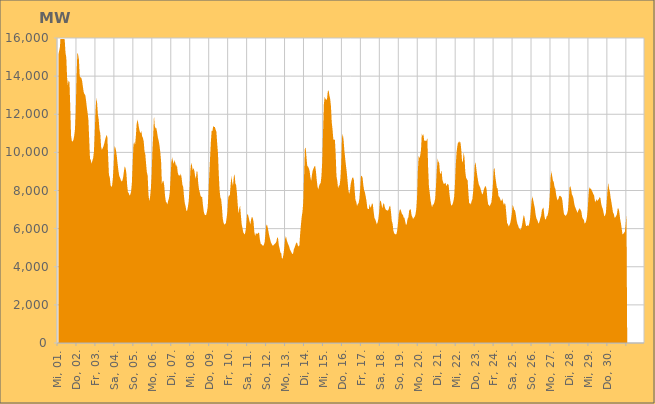
| Category | Series 0 |
|---|---|
|  Mi, 01.  | 15129.188 |
|  Mi, 01.  | 15332.794 |
|  Mi, 01.  | 15533.191 |
|  Mi, 01.  | 16311.189 |
|  Mi, 01.  | 16692.424 |
|  Mi, 01.  | 16361.622 |
|  Mi, 01.  | 16147.71 |
|  Mi, 01.  | 16001.257 |
|  Mi, 01.  | 15901.036 |
|  Mi, 01.  | 15221.841 |
|  Mi, 01.  | 14984.786 |
|  Mi, 01.  | 13926.637 |
|  Mi, 01.  | 13530.777 |
|  Mi, 01.  | 13773.813 |
|  Mi, 01.  | 13686.765 |
|  Mi, 01.  | 12435.264 |
|  Mi, 01.  | 10895.24 |
|  Do, 02.  | 10598.699 |
|  Do, 02.  | 10563.794 |
|  Do, 02.  | 10657.916 |
|  Do, 02.  | 10869.809 |
|  Do, 02.  | 11218.678 |
|  Do, 02.  | 12229.045 |
|  Do, 02.  | 14057.944 |
|  Do, 02.  | 15214.498 |
|  Do, 02.  | 15124.637 |
|  Do, 02.  | 14860.464 |
|  Do, 02.  | 13987.937 |
|  Do, 02.  | 13931.657 |
|  Do, 02.  | 13915.427 |
|  Do, 02.  | 13751.961 |
|  Do, 02.  | 13457.687 |
|  Do, 02.  | 13167.521 |
|  Do, 02.  | 13055.277 |
|  Do, 02.  | 13007.927 |
|  Do, 02.  | 12724.989 |
|  Do, 02.  | 12366.354 |
|  Do, 02.  | 12059.11 |
|  Do, 02.  | 11694.075 |
|  Do, 02.  | 10682.069 |
|  Do, 02.  | 9670.224 |
|  Fr, 03.  | 9595.279 |
|  Fr, 03.  | 9405.787 |
|  Fr, 03.  | 9564.25 |
|  Fr, 03.  | 9701.783 |
|  Fr, 03.  | 10047.847 |
|  Fr, 03.  | 10982.136 |
|  Fr, 03.  | 12200.05 |
|  Fr, 03.  | 12865.334 |
|  Fr, 03.  | 12591.782 |
|  Fr, 03.  | 11988.669 |
|  Fr, 03.  | 11730.204 |
|  Fr, 03.  | 11188.311 |
|  Fr, 03.  | 11015.182 |
|  Fr, 03.  | 10318.119 |
|  Fr, 03.  | 10136.996 |
|  Fr, 03.  | 10218.947 |
|  Fr, 03.  | 10310.523 |
|  Fr, 03.  | 10458.265 |
|  Fr, 03.  | 10643.14 |
|  Fr, 03.  | 10787.427 |
|  Fr, 03.  | 10923.462 |
|  Fr, 03.  | 10783.304 |
|  Fr, 03.  | 9747.387 |
|  Fr, 03.  | 8805.344 |
|  Sa, 04.  | 8706.147 |
|  Sa, 04.  | 8290.012 |
|  Sa, 04.  | 8176.962 |
|  Sa, 04.  | 8270.722 |
|  Sa, 04.  | 8673.351 |
|  Sa, 04.  | 9342.93 |
|  Sa, 04.  | 10338.514 |
|  Sa, 04.  | 10260.533 |
|  Sa, 04.  | 10088.664 |
|  Sa, 04.  | 9760.969 |
|  Sa, 04.  | 9383.084 |
|  Sa, 04.  | 9033.75 |
|  Sa, 04.  | 8767.811 |
|  Sa, 04.  | 8678.89 |
|  Sa, 04.  | 8550.657 |
|  Sa, 04.  | 8474.352 |
|  Sa, 04.  | 8519.159 |
|  Sa, 04.  | 8706.613 |
|  Sa, 04.  | 9021.069 |
|  Sa, 04.  | 9267.148 |
|  Sa, 04.  | 9170.156 |
|  Sa, 04.  | 8929.974 |
|  Sa, 04.  | 8320.134 |
|  Sa, 04.  | 7909.389 |
|  So, 05.  | 7877.523 |
|  So, 05.  | 7730.23 |
|  So, 05.  | 7793.558 |
|  So, 05.  | 7926.397 |
|  So, 05.  | 8396.306 |
|  So, 05.  | 9371.571 |
|  So, 05.  | 10387.619 |
|  So, 05.  | 10544.727 |
|  So, 05.  | 10380.732 |
|  So, 05.  | 10820.693 |
|  So, 05.  | 11461.462 |
|  So, 05.  | 11722.315 |
|  So, 05.  | 11553.776 |
|  So, 05.  | 11280.266 |
|  So, 05.  | 11100.176 |
|  So, 05.  | 11013.572 |
|  So, 05.  | 11120.944 |
|  So, 05.  | 10841.28 |
|  So, 05.  | 10760.231 |
|  So, 05.  | 10575.961 |
|  So, 05.  | 10053.743 |
|  So, 05.  | 9909.442 |
|  So, 05.  | 9392.894 |
|  So, 05.  | 8954.805 |
|  Mo, 06.  | 8780.784 |
|  Mo, 06.  | 7809.707 |
|  Mo, 06.  | 7432.083 |
|  Mo, 06.  | 7656.77 |
|  Mo, 06.  | 8056.603 |
|  Mo, 06.  | 8810.748 |
|  Mo, 06.  | 10084.287 |
|  Mo, 06.  | 10908.467 |
|  Mo, 06.  | 11920.531 |
|  Mo, 06.  | 11387.085 |
|  Mo, 06.  | 11260.627 |
|  Mo, 06.  | 11274.1 |
|  Mo, 06.  | 11034.546 |
|  Mo, 06.  | 10761.878 |
|  Mo, 06.  | 10607.853 |
|  Mo, 06.  | 10353.314 |
|  Mo, 06.  | 10003.29 |
|  Mo, 06.  | 9532.971 |
|  Mo, 06.  | 8346.486 |
|  Mo, 06.  | 8484.547 |
|  Mo, 06.  | 8520.486 |
|  Mo, 06.  | 8248.335 |
|  Mo, 06.  | 7710.859 |
|  Mo, 06.  | 7422.608 |
|  Di, 07.  | 7365.69 |
|  Di, 07.  | 7275.304 |
|  Di, 07.  | 7468.905 |
|  Di, 07.  | 7605.908 |
|  Di, 07.  | 7919.562 |
|  Di, 07.  | 8683.013 |
|  Di, 07.  | 9481.334 |
|  Di, 07.  | 9739.058 |
|  Di, 07.  | 9535.917 |
|  Di, 07.  | 9392.986 |
|  Di, 07.  | 9599.583 |
|  Di, 07.  | 9445.437 |
|  Di, 07.  | 9247.258 |
|  Di, 07.  | 9361.058 |
|  Di, 07.  | 8961.606 |
|  Di, 07.  | 8803.606 |
|  Di, 07.  | 8798.868 |
|  Di, 07.  | 8762.236 |
|  Di, 07.  | 8888.361 |
|  Di, 07.  | 8648.963 |
|  Di, 07.  | 8295.07 |
|  Di, 07.  | 8190.082 |
|  Di, 07.  | 7686.17 |
|  Di, 07.  | 7330.788 |
|  Mi, 08.  | 7177.595 |
|  Mi, 08.  | 6929.504 |
|  Mi, 08.  | 6954.298 |
|  Mi, 08.  | 7155.926 |
|  Mi, 08.  | 7462.753 |
|  Mi, 08.  | 8078.789 |
|  Mi, 08.  | 9017.941 |
|  Mi, 08.  | 9437.181 |
|  Mi, 08.  | 9331.248 |
|  Mi, 08.  | 9061.47 |
|  Mi, 08.  | 9177.834 |
|  Mi, 08.  | 9056.183 |
|  Mi, 08.  | 8775.319 |
|  Mi, 08.  | 8615.961 |
|  Mi, 08.  | 9013.837 |
|  Mi, 08.  | 8975.738 |
|  Mi, 08.  | 8383.212 |
|  Mi, 08.  | 8052.127 |
|  Mi, 08.  | 7897.893 |
|  Mi, 08.  | 7717.422 |
|  Mi, 08.  | 7667.964 |
|  Mi, 08.  | 7652.216 |
|  Mi, 08.  | 7219.705 |
|  Mi, 08.  | 6890.536 |
|  Do, 09.  | 6748.241 |
|  Do, 09.  | 6704.485 |
|  Do, 09.  | 6719.078 |
|  Do, 09.  | 6874.615 |
|  Do, 09.  | 7139.681 |
|  Do, 09.  | 7883.436 |
|  Do, 09.  | 8863.346 |
|  Do, 09.  | 9718.264 |
|  Do, 09.  | 10556.115 |
|  Do, 09.  | 11133.248 |
|  Do, 09.  | 11122.339 |
|  Do, 09.  | 11389.487 |
|  Do, 09.  | 11327.711 |
|  Do, 09.  | 11340.415 |
|  Do, 09.  | 11192.221 |
|  Do, 09.  | 11083.3 |
|  Do, 09.  | 10462.597 |
|  Do, 09.  | 9949.65 |
|  Do, 09.  | 8860.84 |
|  Do, 09.  | 8015.637 |
|  Do, 09.  | 7643.753 |
|  Do, 09.  | 7534.091 |
|  Do, 09.  | 7142.282 |
|  Do, 09.  | 6542.041 |
|  Fr, 10.  | 6312.974 |
|  Fr, 10.  | 6213.031 |
|  Fr, 10.  | 6241.575 |
|  Fr, 10.  | 6297.018 |
|  Fr, 10.  | 6586.853 |
|  Fr, 10.  | 6926.529 |
|  Fr, 10.  | 7633.448 |
|  Fr, 10.  | 7743.58 |
|  Fr, 10.  | 7743.296 |
|  Fr, 10.  | 8295.763 |
|  Fr, 10.  | 8762.66 |
|  Fr, 10.  | 8428.665 |
|  Fr, 10.  | 8241.297 |
|  Fr, 10.  | 8709.613 |
|  Fr, 10.  | 8864.813 |
|  Fr, 10.  | 8381.796 |
|  Fr, 10.  | 8274.403 |
|  Fr, 10.  | 7864.389 |
|  Fr, 10.  | 7254.094 |
|  Fr, 10.  | 6788.5 |
|  Fr, 10.  | 7062.444 |
|  Fr, 10.  | 7204.49 |
|  Fr, 10.  | 6696.925 |
|  Fr, 10.  | 6229.872 |
|  Sa, 11.  | 6029.647 |
|  Sa, 11.  | 5809.64 |
|  Sa, 11.  | 5737.707 |
|  Sa, 11.  | 5697.9 |
|  Sa, 11.  | 5915.406 |
|  Sa, 11.  | 6302.443 |
|  Sa, 11.  | 6763.683 |
|  Sa, 11.  | 6734.324 |
|  Sa, 11.  | 6559.324 |
|  Sa, 11.  | 6365.651 |
|  Sa, 11.  | 6229.942 |
|  Sa, 11.  | 6488.151 |
|  Sa, 11.  | 6622.665 |
|  Sa, 11.  | 6554.198 |
|  Sa, 11.  | 6368.064 |
|  Sa, 11.  | 5823.054 |
|  Sa, 11.  | 5614.773 |
|  Sa, 11.  | 5757.383 |
|  Sa, 11.  | 5733.78 |
|  Sa, 11.  | 5722.4 |
|  Sa, 11.  | 5789.331 |
|  Sa, 11.  | 5783.926 |
|  Sa, 11.  | 5440.101 |
|  Sa, 11.  | 5218.617 |
|  So, 12.  | 5186.505 |
|  So, 12.  | 5133.119 |
|  So, 12.  | 5090.51 |
|  So, 12.  | 5137.161 |
|  So, 12.  | 5278.954 |
|  So, 12.  | 5687.932 |
|  So, 12.  | 6145.379 |
|  So, 12.  | 6218.986 |
|  So, 12.  | 6049.6 |
|  So, 12.  | 5827.202 |
|  So, 12.  | 5604.068 |
|  So, 12.  | 5441.096 |
|  So, 12.  | 5279.217 |
|  So, 12.  | 5194.363 |
|  So, 12.  | 5119.799 |
|  So, 12.  | 5111.623 |
|  So, 12.  | 5167.032 |
|  So, 12.  | 5208.236 |
|  So, 12.  | 5247.328 |
|  So, 12.  | 5332.487 |
|  So, 12.  | 5550.537 |
|  So, 12.  | 5504.342 |
|  So, 12.  | 5132.512 |
|  So, 12.  | 4966.987 |
|  Mo, 13.  | 4742.374 |
|  Mo, 13.  | 4725.855 |
|  Mo, 13.  | 4421.37 |
|  Mo, 13.  | 4451.449 |
|  Mo, 13.  | 4682.437 |
|  Mo, 13.  | 5032.964 |
|  Mo, 13.  | 5454.986 |
|  Mo, 13.  | 5611.722 |
|  Mo, 13.  | 5401.785 |
|  Mo, 13.  | 5273.764 |
|  Mo, 13.  | 5166.055 |
|  Mo, 13.  | 5072.579 |
|  Mo, 13.  | 4923.676 |
|  Mo, 13.  | 4839.069 |
|  Mo, 13.  | 4752.501 |
|  Mo, 13.  | 4673.439 |
|  Mo, 13.  | 4680.597 |
|  Mo, 13.  | 4910.188 |
|  Mo, 13.  | 5011.934 |
|  Mo, 13.  | 5136.734 |
|  Mo, 13.  | 5248.318 |
|  Mo, 13.  | 5271.407 |
|  Mo, 13.  | 5127.69 |
|  Mo, 13.  | 5064.487 |
|  Di, 14.  | 5114.122 |
|  Di, 14.  | 5724.313 |
|  Di, 14.  | 6202.522 |
|  Di, 14.  | 6625.065 |
|  Di, 14.  | 6900.708 |
|  Di, 14.  | 7417.952 |
|  Di, 14.  | 8793.321 |
|  Di, 14.  | 10201.6 |
|  Di, 14.  | 10239.092 |
|  Di, 14.  | 9749.555 |
|  Di, 14.  | 9293.914 |
|  Di, 14.  | 9253.474 |
|  Di, 14.  | 9162.247 |
|  Di, 14.  | 9016.101 |
|  Di, 14.  | 8698.267 |
|  Di, 14.  | 8499.977 |
|  Di, 14.  | 8840.246 |
|  Di, 14.  | 9068.832 |
|  Di, 14.  | 9158.85 |
|  Di, 14.  | 9263.957 |
|  Di, 14.  | 9290.594 |
|  Di, 14.  | 8999.279 |
|  Di, 14.  | 8545.524 |
|  Di, 14.  | 8204.157 |
|  Mi, 15.  | 8053.42 |
|  Mi, 15.  | 8246.925 |
|  Mi, 15.  | 8344.151 |
|  Mi, 15.  | 8394.277 |
|  Mi, 15.  | 8768.736 |
|  Mi, 15.  | 9540.429 |
|  Mi, 15.  | 11098.58 |
|  Mi, 15.  | 12504.243 |
|  Mi, 15.  | 12906.61 |
|  Mi, 15.  | 12811.111 |
|  Mi, 15.  | 12756.761 |
|  Mi, 15.  | 12787.014 |
|  Mi, 15.  | 13197.006 |
|  Mi, 15.  | 13263.857 |
|  Mi, 15.  | 12987.074 |
|  Mi, 15.  | 12806.067 |
|  Mi, 15.  | 12422.396 |
|  Mi, 15.  | 11574.776 |
|  Mi, 15.  | 11202.471 |
|  Mi, 15.  | 10693.252 |
|  Mi, 15.  | 10650.446 |
|  Mi, 15.  | 10675.202 |
|  Mi, 15.  | 9892.251 |
|  Mi, 15.  | 8744.247 |
|  Do, 16.  | 8517.106 |
|  Do, 16.  | 8117.667 |
|  Do, 16.  | 8243.593 |
|  Do, 16.  | 8282.247 |
|  Do, 16.  | 8646.199 |
|  Do, 16.  | 9420.477 |
|  Do, 16.  | 10752.752 |
|  Do, 16.  | 10976.462 |
|  Do, 16.  | 10625.328 |
|  Do, 16.  | 10093.796 |
|  Do, 16.  | 9690.169 |
|  Do, 16.  | 9302.604 |
|  Do, 16.  | 8966.502 |
|  Do, 16.  | 8500.074 |
|  Do, 16.  | 8046.648 |
|  Do, 16.  | 7822.666 |
|  Do, 16.  | 7976.19 |
|  Do, 16.  | 8337.687 |
|  Do, 16.  | 8526.17 |
|  Do, 16.  | 8665.086 |
|  Do, 16.  | 8685.527 |
|  Do, 16.  | 8555.609 |
|  Do, 16.  | 8014.958 |
|  Do, 16.  | 7514.482 |
|  Fr, 17.  | 7403.92 |
|  Fr, 17.  | 7191.385 |
|  Fr, 17.  | 7282.294 |
|  Fr, 17.  | 7345.196 |
|  Fr, 17.  | 7572.758 |
|  Fr, 17.  | 8090.358 |
|  Fr, 17.  | 8770.392 |
|  Fr, 17.  | 8755.96 |
|  Fr, 17.  | 8680.24 |
|  Fr, 17.  | 8265.84 |
|  Fr, 17.  | 8012.876 |
|  Fr, 17.  | 7900.667 |
|  Fr, 17.  | 7679.441 |
|  Fr, 17.  | 7442.963 |
|  Fr, 17.  | 7080.324 |
|  Fr, 17.  | 7024.085 |
|  Fr, 17.  | 7033.42 |
|  Fr, 17.  | 7292.239 |
|  Fr, 17.  | 7083.436 |
|  Fr, 17.  | 7181.273 |
|  Fr, 17.  | 7333.126 |
|  Fr, 17.  | 7268.901 |
|  Fr, 17.  | 6894.331 |
|  Fr, 17.  | 6571.414 |
|  Sa, 18.  | 6487.761 |
|  Sa, 18.  | 6367.515 |
|  Sa, 18.  | 6221.611 |
|  Sa, 18.  | 6314.493 |
|  Sa, 18.  | 6504.251 |
|  Sa, 18.  | 6857.324 |
|  Sa, 18.  | 7406.239 |
|  Sa, 18.  | 7493.253 |
|  Sa, 18.  | 7276.25 |
|  Sa, 18.  | 7060.96 |
|  Sa, 18.  | 7266.526 |
|  Sa, 18.  | 7343.579 |
|  Sa, 18.  | 7153.254 |
|  Sa, 18.  | 7020.596 |
|  Sa, 18.  | 6973.622 |
|  Sa, 18.  | 6963.325 |
|  Sa, 18.  | 6938.688 |
|  Sa, 18.  | 7017.011 |
|  Sa, 18.  | 7158.221 |
|  Sa, 18.  | 7199.868 |
|  Sa, 18.  | 6867.234 |
|  Sa, 18.  | 6400.137 |
|  Sa, 18.  | 6269.309 |
|  Sa, 18.  | 5906.84 |
|  So, 19.  | 5761.338 |
|  So, 19.  | 5713.896 |
|  So, 19.  | 5697.215 |
|  So, 19.  | 5725.283 |
|  So, 19.  | 5948.516 |
|  So, 19.  | 6340.322 |
|  So, 19.  | 6774.066 |
|  So, 19.  | 6974.586 |
|  So, 19.  | 7015.92 |
|  So, 19.  | 6884.334 |
|  So, 19.  | 6752.961 |
|  So, 19.  | 6736.343 |
|  So, 19.  | 6585.112 |
|  So, 19.  | 6567.009 |
|  So, 19.  | 6365.198 |
|  So, 19.  | 6181.345 |
|  So, 19.  | 6262.128 |
|  So, 19.  | 6519.07 |
|  So, 19.  | 6600.034 |
|  So, 19.  | 6939.205 |
|  So, 19.  | 7010.608 |
|  So, 19.  | 7009.398 |
|  So, 19.  | 6706.521 |
|  So, 19.  | 6609.656 |
|  Mo, 20.  | 6503.719 |
|  Mo, 20.  | 6577.709 |
|  Mo, 20.  | 6621.281 |
|  Mo, 20.  | 6747.296 |
|  Mo, 20.  | 7021.753 |
|  Mo, 20.  | 7636.835 |
|  Mo, 20.  | 9025.043 |
|  Mo, 20.  | 9815.723 |
|  Mo, 20.  | 9693.503 |
|  Mo, 20.  | 9842.605 |
|  Mo, 20.  | 10146.362 |
|  Mo, 20.  | 10982.94 |
|  Mo, 20.  | 10864.101 |
|  Mo, 20.  | 10952.895 |
|  Mo, 20.  | 10630.228 |
|  Mo, 20.  | 10586.347 |
|  Mo, 20.  | 10620.504 |
|  Mo, 20.  | 10609.336 |
|  Mo, 20.  | 10771.993 |
|  Mo, 20.  | 9195.783 |
|  Mo, 20.  | 8223.224 |
|  Mo, 20.  | 7878.464 |
|  Mo, 20.  | 7501.847 |
|  Mo, 20.  | 7274.161 |
|  Di, 21.  | 7119.807 |
|  Di, 21.  | 7271.26 |
|  Di, 21.  | 7269.247 |
|  Di, 21.  | 7395.903 |
|  Di, 21.  | 7596.258 |
|  Di, 21.  | 8275.673 |
|  Di, 21.  | 9086.331 |
|  Di, 21.  | 9661.459 |
|  Di, 21.  | 9515.108 |
|  Di, 21.  | 9442.005 |
|  Di, 21.  | 8915.741 |
|  Di, 21.  | 8877.957 |
|  Di, 21.  | 9060.632 |
|  Di, 21.  | 8579.44 |
|  Di, 21.  | 8433.502 |
|  Di, 21.  | 8335.324 |
|  Di, 21.  | 8365.618 |
|  Di, 21.  | 8413.434 |
|  Di, 21.  | 8225.664 |
|  Di, 21.  | 8307.04 |
|  Di, 21.  | 8347.94 |
|  Di, 21.  | 8273.225 |
|  Di, 21.  | 7818.534 |
|  Di, 21.  | 7488.783 |
|  Mi, 22.  | 7241.668 |
|  Mi, 22.  | 7208.134 |
|  Mi, 22.  | 7296.538 |
|  Mi, 22.  | 7444.002 |
|  Mi, 22.  | 7675.802 |
|  Mi, 22.  | 8394.051 |
|  Mi, 22.  | 9367.233 |
|  Mi, 22.  | 10006.085 |
|  Mi, 22.  | 10336.348 |
|  Mi, 22.  | 10564.935 |
|  Mi, 22.  | 10481.222 |
|  Mi, 22.  | 10591.43 |
|  Mi, 22.  | 10498.399 |
|  Mi, 22.  | 10117.624 |
|  Mi, 22.  | 9483.541 |
|  Mi, 22.  | 9567.23 |
|  Mi, 22.  | 10002.944 |
|  Mi, 22.  | 9732.738 |
|  Mi, 22.  | 9003.029 |
|  Mi, 22.  | 8670.331 |
|  Mi, 22.  | 8589.548 |
|  Mi, 22.  | 8526.313 |
|  Mi, 22.  | 7856.809 |
|  Mi, 22.  | 7297.995 |
|  Do, 23.  | 7360.413 |
|  Do, 23.  | 7254.032 |
|  Do, 23.  | 7450.015 |
|  Do, 23.  | 7550.86 |
|  Do, 23.  | 7951.317 |
|  Do, 23.  | 8576.319 |
|  Do, 23.  | 9313.54 |
|  Do, 23.  | 9494.711 |
|  Do, 23.  | 9148.306 |
|  Do, 23.  | 8823.704 |
|  Do, 23.  | 8563.283 |
|  Do, 23.  | 8345.263 |
|  Do, 23.  | 8236.059 |
|  Do, 23.  | 8158.531 |
|  Do, 23.  | 7986.409 |
|  Do, 23.  | 7848.629 |
|  Do, 23.  | 7793.986 |
|  Do, 23.  | 7960.962 |
|  Do, 23.  | 8112.211 |
|  Do, 23.  | 8208.074 |
|  Do, 23.  | 8227.424 |
|  Do, 23.  | 8063.293 |
|  Do, 23.  | 7569.408 |
|  Do, 23.  | 7262.875 |
|  Fr, 24.  | 7243.5 |
|  Fr, 24.  | 7164.456 |
|  Fr, 24.  | 7283.778 |
|  Fr, 24.  | 7372.378 |
|  Fr, 24.  | 7716.405 |
|  Fr, 24.  | 8327.236 |
|  Fr, 24.  | 9108.105 |
|  Fr, 24.  | 9186.76 |
|  Fr, 24.  | 8726.755 |
|  Fr, 24.  | 8443.825 |
|  Fr, 24.  | 8139.162 |
|  Fr, 24.  | 8108.273 |
|  Fr, 24.  | 7698.56 |
|  Fr, 24.  | 7671.926 |
|  Fr, 24.  | 7582.623 |
|  Fr, 24.  | 7464.538 |
|  Fr, 24.  | 7475.148 |
|  Fr, 24.  | 7576.804 |
|  Fr, 24.  | 7366.301 |
|  Fr, 24.  | 7228.953 |
|  Fr, 24.  | 7352.926 |
|  Fr, 24.  | 7234.97 |
|  Fr, 24.  | 6744.144 |
|  Fr, 24.  | 6286.861 |
|  Sa, 25.  | 6225.943 |
|  Sa, 25.  | 6109.945 |
|  Sa, 25.  | 6187.119 |
|  Sa, 25.  | 6303.916 |
|  Sa, 25.  | 6516.578 |
|  Sa, 25.  | 6813.457 |
|  Sa, 25.  | 7241.315 |
|  Sa, 25.  | 7137.32 |
|  Sa, 25.  | 6986.144 |
|  Sa, 25.  | 6954.959 |
|  Sa, 25.  | 6739.231 |
|  Sa, 25.  | 6442.422 |
|  Sa, 25.  | 6249.875 |
|  Sa, 25.  | 6160.369 |
|  Sa, 25.  | 6016.298 |
|  Sa, 25.  | 5983.111 |
|  Sa, 25.  | 5944.168 |
|  Sa, 25.  | 6027.04 |
|  Sa, 25.  | 6221.258 |
|  Sa, 25.  | 6495.892 |
|  Sa, 25.  | 6714.599 |
|  Sa, 25.  | 6599.443 |
|  Sa, 25.  | 6332.153 |
|  Sa, 25.  | 6133.514 |
|  So, 26.  | 6138.761 |
|  So, 26.  | 6185.19 |
|  So, 26.  | 6135.992 |
|  So, 26.  | 6268.093 |
|  So, 26.  | 6500.689 |
|  So, 26.  | 6978.37 |
|  So, 26.  | 7465.628 |
|  So, 26.  | 7691.101 |
|  So, 26.  | 7492.236 |
|  So, 26.  | 7277.416 |
|  So, 26.  | 7088.868 |
|  So, 26.  | 6751.716 |
|  So, 26.  | 6549.002 |
|  So, 26.  | 6467.933 |
|  So, 26.  | 6343.477 |
|  So, 26.  | 6258.641 |
|  So, 26.  | 6377.445 |
|  So, 26.  | 6542.901 |
|  So, 26.  | 6665.492 |
|  So, 26.  | 6974.794 |
|  So, 26.  | 7053.717 |
|  So, 26.  | 7113.081 |
|  So, 26.  | 6717.712 |
|  So, 26.  | 6493.543 |
|  Mo, 27.  | 6485.202 |
|  Mo, 27.  | 6632.699 |
|  Mo, 27.  | 6669.913 |
|  Mo, 27.  | 6840.964 |
|  Mo, 27.  | 7126.762 |
|  Mo, 27.  | 7750.572 |
|  Mo, 27.  | 8678.102 |
|  Mo, 27.  | 9006.423 |
|  Mo, 27.  | 8760.95 |
|  Mo, 27.  | 8508.286 |
|  Mo, 27.  | 8453.963 |
|  Mo, 27.  | 8173.022 |
|  Mo, 27.  | 8091.731 |
|  Mo, 27.  | 7793.554 |
|  Mo, 27.  | 7585.323 |
|  Mo, 27.  | 7483.124 |
|  Mo, 27.  | 7571.331 |
|  Mo, 27.  | 7705.543 |
|  Mo, 27.  | 7722.7 |
|  Mo, 27.  | 7688.702 |
|  Mo, 27.  | 7640.457 |
|  Mo, 27.  | 7460.316 |
|  Mo, 27.  | 7046.154 |
|  Mo, 27.  | 6750.967 |
|  Di, 28.  | 6720.744 |
|  Di, 28.  | 6662.782 |
|  Di, 28.  | 6720.636 |
|  Di, 28.  | 6801.121 |
|  Di, 28.  | 6969.81 |
|  Di, 28.  | 7495.456 |
|  Di, 28.  | 8146.07 |
|  Di, 28.  | 8234.479 |
|  Di, 28.  | 8052.828 |
|  Di, 28.  | 7796.275 |
|  Di, 28.  | 7713.708 |
|  Di, 28.  | 7576.714 |
|  Di, 28.  | 7294.607 |
|  Di, 28.  | 7138.19 |
|  Di, 28.  | 7044.732 |
|  Di, 28.  | 6935.036 |
|  Di, 28.  | 6825.179 |
|  Di, 28.  | 6936.677 |
|  Di, 28.  | 7011.905 |
|  Di, 28.  | 7069.747 |
|  Di, 28.  | 6980.864 |
|  Di, 28.  | 6886.057 |
|  Di, 28.  | 6604.107 |
|  Di, 28.  | 6508.826 |
|  Mi, 29.  | 6479.78 |
|  Mi, 29.  | 6272.808 |
|  Mi, 29.  | 6295.29 |
|  Mi, 29.  | 6396.486 |
|  Mi, 29.  | 6608.539 |
|  Mi, 29.  | 6991.388 |
|  Mi, 29.  | 7757.252 |
|  Mi, 29.  | 8178.644 |
|  Mi, 29.  | 8081.846 |
|  Mi, 29.  | 8112.164 |
|  Mi, 29.  | 8004.15 |
|  Mi, 29.  | 7927.015 |
|  Mi, 29.  | 7817.332 |
|  Mi, 29.  | 7749.21 |
|  Mi, 29.  | 7483.682 |
|  Mi, 29.  | 7387.311 |
|  Mi, 29.  | 7551.827 |
|  Mi, 29.  | 7443.03 |
|  Mi, 29.  | 7505.993 |
|  Mi, 29.  | 7543.81 |
|  Mi, 29.  | 7653.906 |
|  Mi, 29.  | 7613.079 |
|  Mi, 29.  | 7316.307 |
|  Mi, 29.  | 7144.281 |
|  Do, 30.  | 7036.312 |
|  Do, 30.  | 6853.769 |
|  Do, 30.  | 6646.074 |
|  Do, 30.  | 6691.024 |
|  Do, 30.  | 6832.278 |
|  Do, 30.  | 7333.445 |
|  Do, 30.  | 7987.101 |
|  Do, 30.  | 8411.838 |
|  Do, 30.  | 8102.108 |
|  Do, 30.  | 7941.461 |
|  Do, 30.  | 7622.924 |
|  Do, 30.  | 7380.631 |
|  Do, 30.  | 7123.097 |
|  Do, 30.  | 6842.227 |
|  Do, 30.  | 6774.163 |
|  Do, 30.  | 6563.856 |
|  Do, 30.  | 6599.117 |
|  Do, 30.  | 6665.101 |
|  Do, 30.  | 6758.214 |
|  Do, 30.  | 7075.174 |
|  Do, 30.  | 7056.722 |
|  Do, 30.  | 6863.416 |
|  Do, 30.  | 6511.347 |
|  Do, 30.  | 6281.562 |
|  Fr, 01.  | 6001.046 |
|  Fr, 01.  | 5695.699 |
|  Fr, 01.  | 5725.73 |
|  Fr, 01.  | 5781.945 |
|  Fr, 01.  | 5836.218 |
|  Fr, 01.  | 6212.877 |
|    | 6681.517 |
|    | 0 |
|    | 0 |
|    | 0 |
|    | 0 |
|    | 0 |
|    | 0 |
|    | 0 |
|    | 0 |
|    | 0 |
|    | 0 |
|    | 0 |
|    | 0 |
|    | 0 |
|    | 0 |
|    | 0 |
|    | 0 |
|    | 0 |
|    | 0 |
|    | 0 |
|    | 0 |
|    | 0 |
|    | 0 |
|    | 0 |